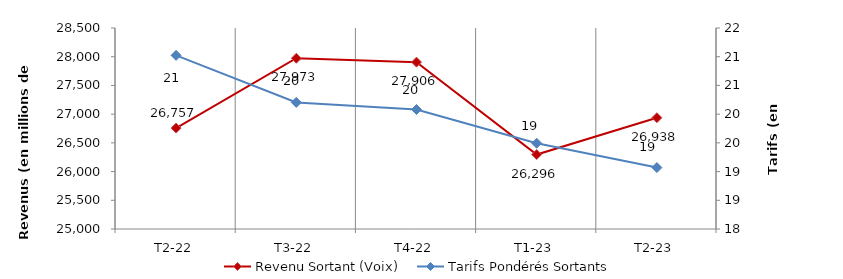
| Category | Revenu Sortant (Voix) |
|---|---|
| T2-22 | 26756.839 |
| T3-22 | 27973.147 |
| T4-22 | 27905.637 |
| T1-23 | 26296.452 |
| T2-23 | 26937.819 |